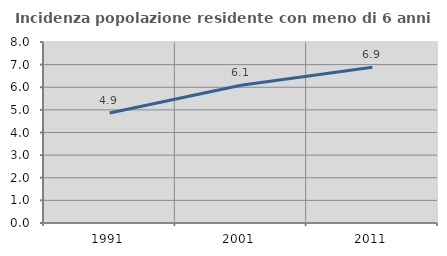
| Category | Incidenza popolazione residente con meno di 6 anni |
|---|---|
| 1991.0 | 4.864 |
| 2001.0 | 6.091 |
| 2011.0 | 6.883 |